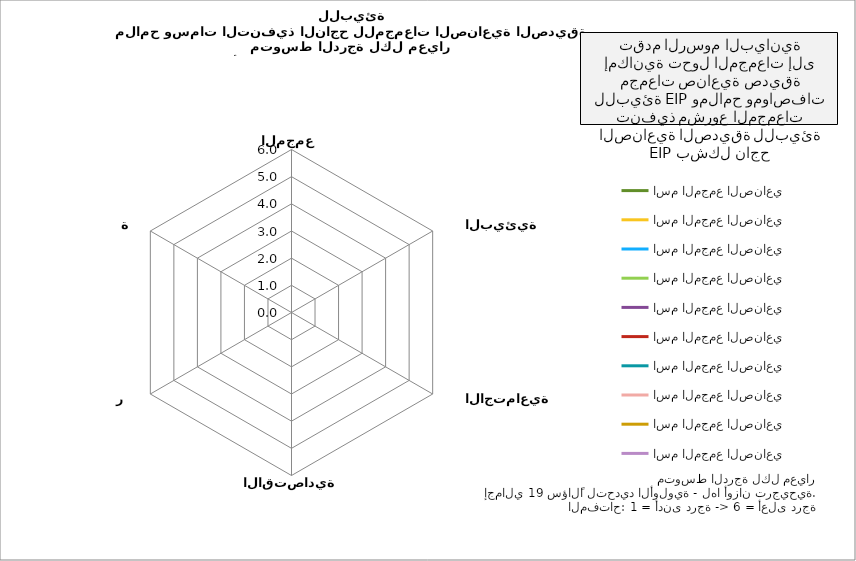
| Category | اسم المجمع الصناعي |
|---|---|
| إدارة المجمع  | 0 |
| التدخلات البيئية | 0 |
| التدخلات الاجتماعية | 0 |
| التدخلات الاقتصادية | 0 |
| التكرار | 0 |
| الرؤية | 0 |